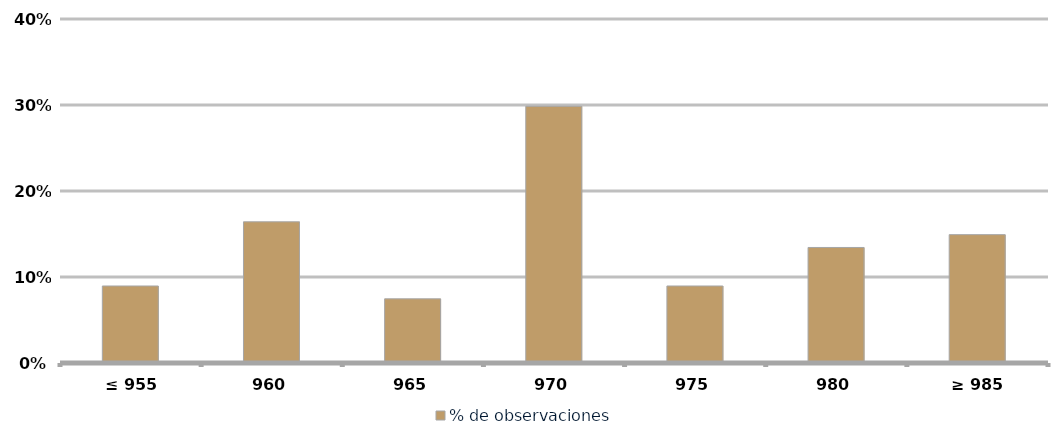
| Category | % de observaciones  |
|---|---|
|  ≤ 955  | 0.09 |
|  960  | 0.164 |
|  965  | 0.075 |
|  970  | 0.299 |
|  975  | 0.09 |
|  980  | 0.134 |
|  ≥ 985  | 0.149 |